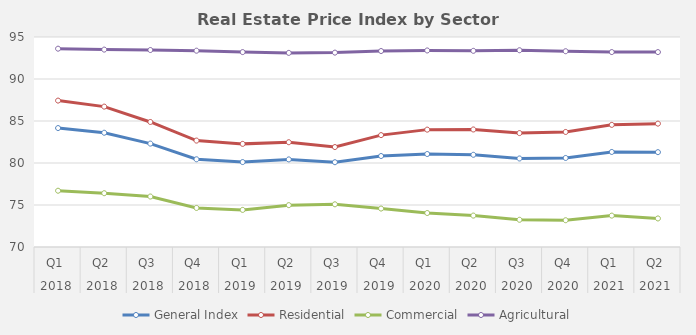
| Category | General Index | Residential | Commercial | Agricultural |
|---|---|---|---|---|
| 0 | 84.16 | 87.43 | 76.7 | 93.61 |
| 1 | 83.603 | 86.713 | 76.403 | 93.5 |
| 2 | 82.31 | 84.883 | 76.01 | 93.45 |
| 3 | 80.443 | 82.67 | 74.65 | 93.37 |
| 4 | 80.11 | 82.277 | 74.417 | 93.203 |
| 5 | 80.427 | 82.473 | 74.983 | 93.11 |
| 6 | 80.093 | 81.9 | 75.083 | 93.14 |
| 7 | 80.833 | 83.32 | 74.577 | 93.33 |
| 8 | 81.07 | 83.973 | 74.047 | 93.397 |
| 9 | 80.977 | 83.99 | 73.74 | 93.353 |
| 10 | 80.538 | 83.562 | 73.242 | 93.424 |
| 11 | 80.6 | 83.696 | 73.187 | 93.307 |
| 12 | 81.315 | 84.54 | 73.736 | 93.206 |
| 13 | 81.291 | 84.687 | 73.398 | 93.204 |